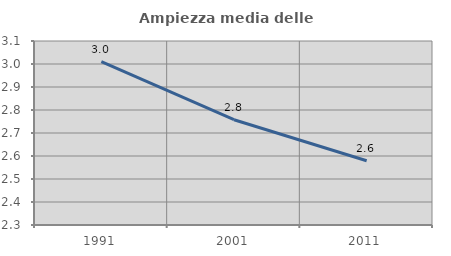
| Category | Ampiezza media delle famiglie |
|---|---|
| 1991.0 | 3.01 |
| 2001.0 | 2.758 |
| 2011.0 | 2.579 |